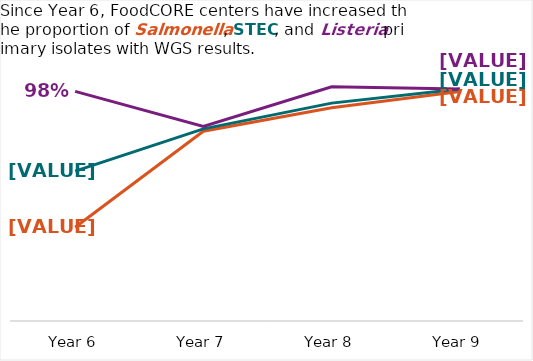
| Category | Salmonella | STEC | Listeria |
|---|---|---|---|
| Year 6 | 40 | 64 | 98 |
| Year 7 | 81 | 82 | 83 |
| Year 8 | 91 | 93 | 100 |
| Year 9 | 98 | 99 | 99 |